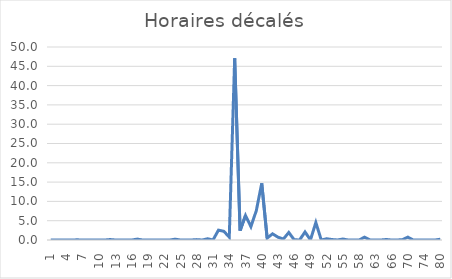
| Category | Horaires décalés |
|---|---|
| 1.0 | 0 |
| 2.0 | 0 |
| 3.0 | 0.02 |
| 4.0 | 0.02 |
| 5.0 | 0.02 |
| 6.0 | 0.04 |
| 7.0 | 0 |
| 8.0 | 0 |
| 9.0 | 0.01 |
| 10.0 | 0.01 |
| 11.0 | 0 |
| 12.0 | 0.12 |
| 13.0 | 0 |
| 14.0 | 0 |
| 15.0 | 0.02 |
| 16.0 | 0 |
| 17.0 | 0.23 |
| 18.0 | 0 |
| 19.0 | 0 |
| 20.0 | 0 |
| 21.0 | 0 |
| 22.0 | 0 |
| 23.0 | 0 |
| 24.0 | 0.21 |
| 25.0 | 0 |
| 26.0 | 0 |
| 27.0 | 0.01 |
| 28.0 | 0.1 |
| 29.0 | 0 |
| 30.0 | 0.32 |
| 31.0 | 0 |
| 32.0 | 2.55 |
| 33.0 | 2.25 |
| 34.0 | 0.74 |
| 35.0 | 47.1 |
| 36.0 | 2.42 |
| 37.0 | 6.35 |
| 38.0 | 3.46 |
| 39.0 | 7.62 |
| 40.0 | 14.69 |
| 41.0 | 0.49 |
| 42.0 | 1.6 |
| 43.0 | 0.73 |
| 44.0 | 0.25 |
| 45.0 | 1.95 |
| 46.0 | 0.05 |
| 47.0 | 0.02 |
| 48.0 | 2.09 |
| 49.0 | 0.01 |
| 50.0 | 4.53 |
| 51.0 | 0 |
| 52.0 | 0.32 |
| 53.0 | 0.12 |
| 54.0 | 0.01 |
| 55.0 | 0.25 |
| 56.0 | 0 |
| 57.0 | 0.02 |
| 58.0 | 0 |
| 60.0 | 0.73 |
| 62.0 | 0.02 |
| 63.0 | 0 |
| 64.0 | 0 |
| 65.0 | 0.13 |
| 66.0 | 0 |
| 67.0 | 0 |
| 68.0 | 0.09 |
| 70.0 | 0.74 |
| 71.0 | 0 |
| 72.0 | 0.03 |
| 74.0 | 0 |
| 75.0 | 0 |
| 78.0 | 0 |
| 80.0 | 0.19 |